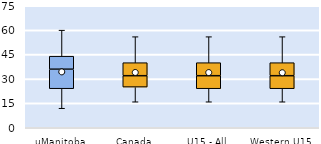
| Category | 25th | 50th | 75th |
|---|---|---|---|
| uManitoba | 24 | 12 | 8 |
| Canada | 25 | 7 | 8 |
| U15 - All | 24 | 8 | 8 |
| Western U15 | 24 | 8 | 8 |